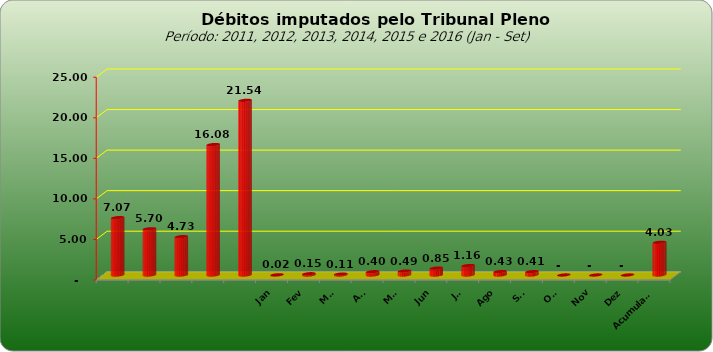
| Category |  7.073.154,74  |
|---|---|
|  | 7073154.74 |
|  | 5698720.25 |
|  | 4727033.51 |
|  | 16081820.48 |
|  | 21535723.6 |
| Jan | 22059.63 |
| Fev | 154318.14 |
| Mar | 112460.95 |
| Abr | 404403.01 |
| Mai | 486409.52 |
| Jun | 852405.84 |
| Jul | 1163444.79 |
| Ago | 426141.81 |
| Set | 412616.73 |
| Out | 0 |
| Nov | 0 |
| Dez | 0 |
| Acumulado | 4034260.42 |